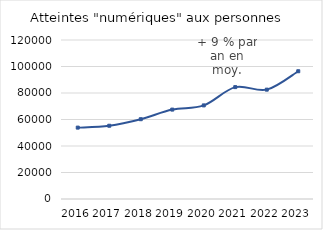
| Category | Atteintes aux personnes |
|---|---|
| 2016.0 | 53869 |
| 2017.0 | 55288 |
| 2018.0 | 60220 |
| 2019.0 | 67471 |
| 2020.0 | 70642 |
| 2021.0 | 84440 |
| 2022.0 | 82530 |
| 2023.0 | 96417 |